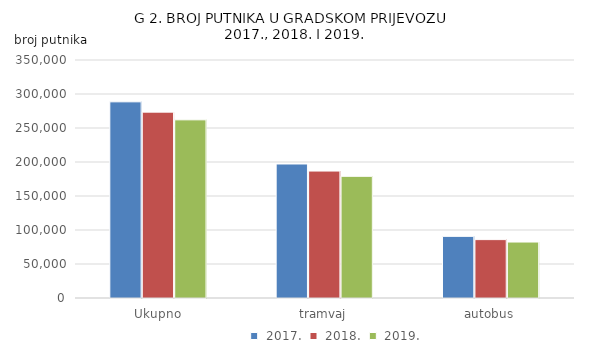
| Category |  2017. |  2018. |  2019. |
|---|---|---|---|
| Ukupno | 288471 | 273342 | 262008 |
| tramvaj | 197078 | 186693 | 178952 |
| autobus | 90634 | 85849 | 82285 |